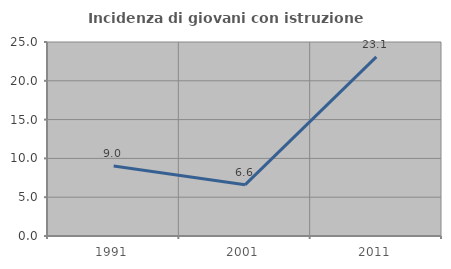
| Category | Incidenza di giovani con istruzione universitaria |
|---|---|
| 1991.0 | 9.009 |
| 2001.0 | 6.593 |
| 2011.0 | 23.077 |